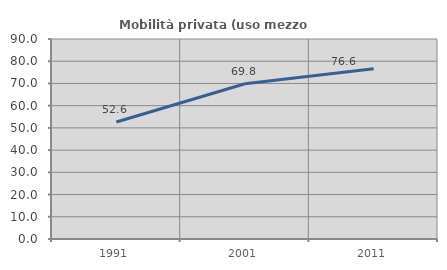
| Category | Mobilità privata (uso mezzo privato) |
|---|---|
| 1991.0 | 52.626 |
| 2001.0 | 69.845 |
| 2011.0 | 76.564 |